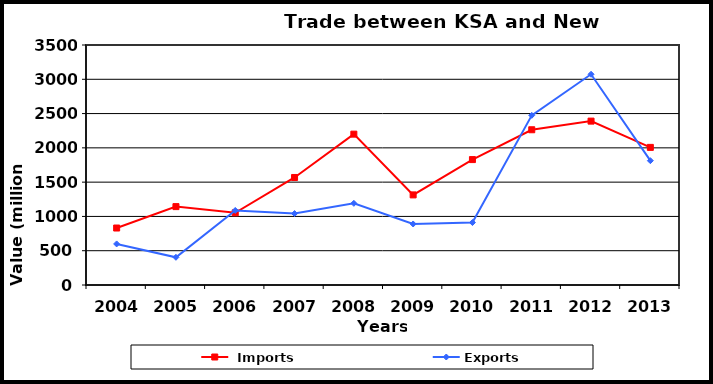
| Category |  Imports | Exports |
|---|---|---|
| 2004.0 | 831 | 599 |
| 2005.0 | 1143 | 404 |
| 2006.0 | 1053 | 1087 |
| 2007.0 | 1568 | 1042 |
| 2008.0 | 2200 | 1191 |
| 2009.0 | 1314 | 890 |
| 2010.0 | 1829 | 911 |
| 2011.0 | 2264 | 2474 |
| 2012.0 | 2390 | 3073 |
| 2013.0 | 2007 | 1813 |